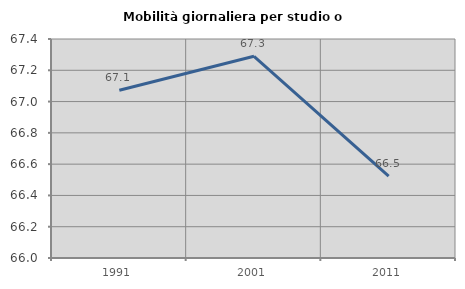
| Category | Mobilità giornaliera per studio o lavoro |
|---|---|
| 1991.0 | 67.073 |
| 2001.0 | 67.29 |
| 2011.0 | 66.523 |